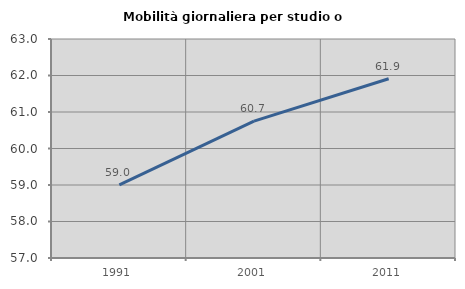
| Category | Mobilità giornaliera per studio o lavoro |
|---|---|
| 1991.0 | 59.002 |
| 2001.0 | 60.749 |
| 2011.0 | 61.91 |